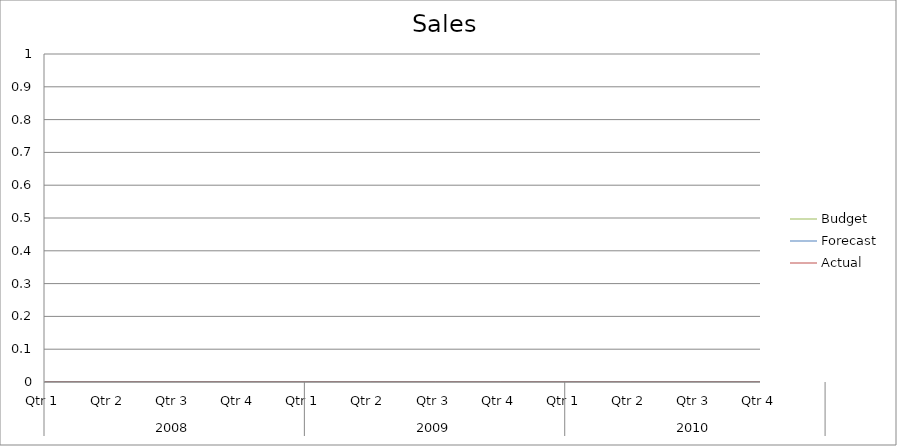
| Category | Budget | Forecast | Actual |
|---|---|---|---|
| 0 | 1340 | 2290 | 1680 |
| 1 | 1470 | 2560 | 2670 |
| 2 | 2230 | 2540 | 2700 |
| 3 | 1710 | 1150 | 1510 |
| 4 | 2230 | 2620 | 3480 |
| 5 | 3000 | 920 | 1360 |
| 6 | 870 | 1860 | 2830 |
| 7 | 720 | 2680 | 1470 |
| 8 | 980 | 780 | 2960 |
| 9 | 2480 | 1460 | 1300 |
| 10 | 2160 | 2280 | 1330 |
| 11 | 2470 | 610 | 1930 |